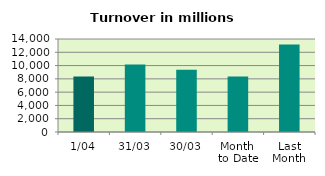
| Category | Series 0 |
|---|---|
| 1/04 | 8343.837 |
| 31/03 | 10148.849 |
| 30/03 | 9358.922 |
| Month 
to Date | 8343.837 |
| Last
Month | 13160.868 |